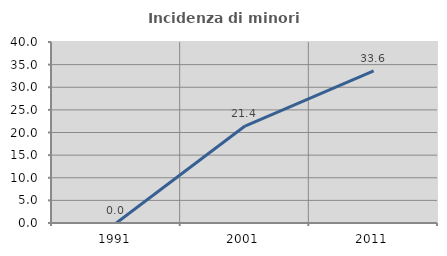
| Category | Incidenza di minori stranieri |
|---|---|
| 1991.0 | 0 |
| 2001.0 | 21.429 |
| 2011.0 | 33.607 |